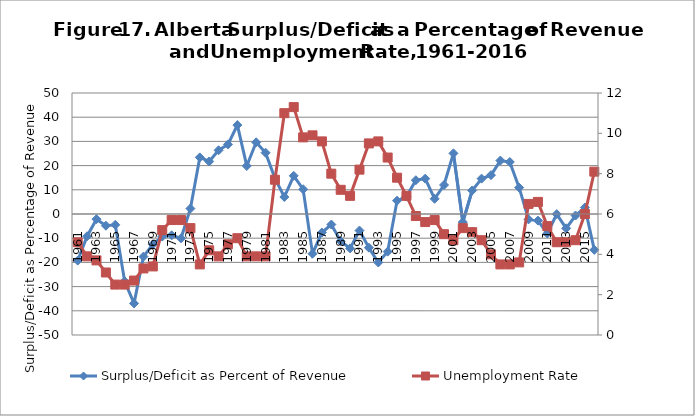
| Category | Surplus/Deficit as Percent of Revenue |
|---|---|
| 1961.0 | -19.257 |
| 1962.0 | -9.195 |
| 1963.0 | -2.133 |
| 1964.0 | -4.835 |
| 1965.0 | -4.478 |
| 1966.0 | -27.81 |
| 1967.0 | -36.943 |
| 1968.0 | -17.606 |
| 1969.0 | -12.543 |
| 1970.0 | -9.324 |
| 1971.0 | -8.819 |
| 1972.0 | -10.045 |
| 1973.0 | 2.251 |
| 1974.0 | 23.394 |
| 1975.0 | 21.709 |
| 1976.0 | 26.335 |
| 1977.0 | 28.761 |
| 1978.0 | 36.74 |
| 1979.0 | 19.859 |
| 1980.0 | 29.635 |
| 1981.0 | 25.329 |
| 1982.0 | 14.717 |
| 1983.0 | 7.019 |
| 1984.0 | 15.775 |
| 1985.0 | 10.223 |
| 1986.0 | -16.418 |
| 1987.0 | -7.661 |
| 1988.0 | -4.349 |
| 1989.0 | -11.258 |
| 1990.0 | -14.199 |
| 1991.0 | -6.827 |
| 1992.0 | -13.919 |
| 1993.0 | -20.041 |
| 1994.0 | -15.545 |
| 1995.0 | 5.502 |
| 1996.0 | 7.177 |
| 1997.0 | 13.954 |
| 1998.0 | 14.613 |
| 1999.0 | 6.278 |
| 2000.0 | 11.984 |
| 2001.0 | 25.056 |
| 2002.0 | -3.334 |
| 2003.0 | 9.725 |
| 2004.0 | 14.607 |
| 2005.0 | 16.056 |
| 2006.0 | 22.066 |
| 2007.0 | 21.488 |
| 2008.0 | 10.899 |
| 2009.0 | -2.228 |
| 2010.0 | -2.723 |
| 2011.0 | -8.056 |
| 2012.0 | -0.055 |
| 2013.0 | -5.919 |
| 2014.0 | -0.63 |
| 2015.0 | 2.683 |
| 2016.0 | -14.833 |